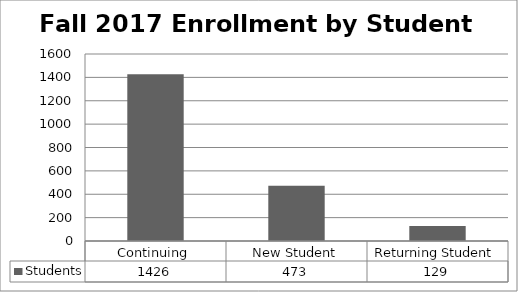
| Category | Students |
|---|---|
| Continuing | 1426 |
| New Student | 473 |
| Returning Student | 129 |